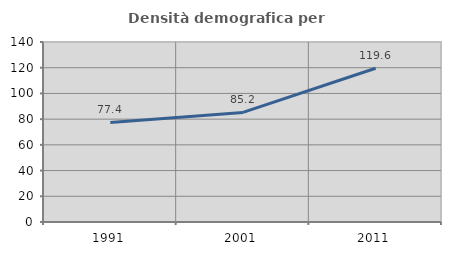
| Category | Densità demografica |
|---|---|
| 1991.0 | 77.422 |
| 2001.0 | 85.221 |
| 2011.0 | 119.554 |